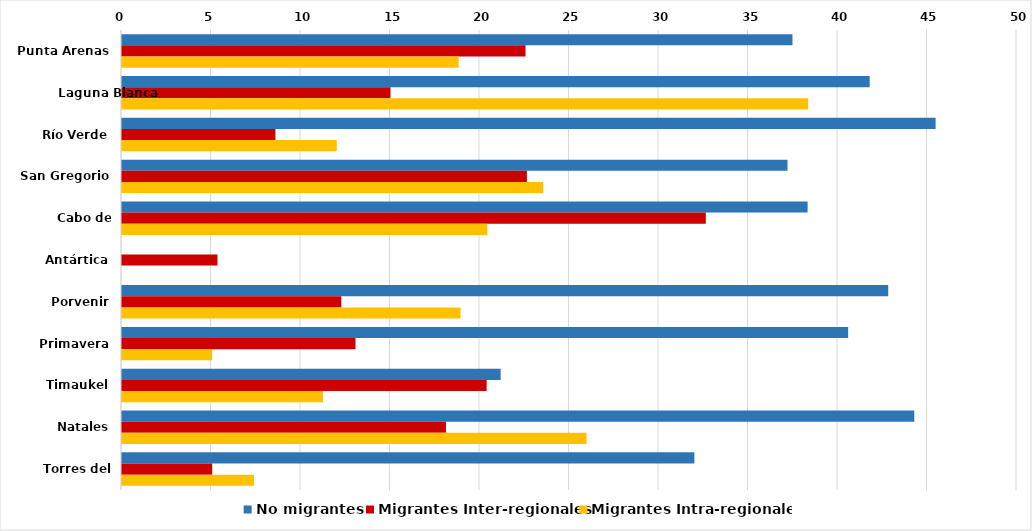
| Category | No migrantes | Migrantes Inter-regionales | Migrantes Intra-regionales |
|---|---|---|---|
| Punta Arenas | 37.456 | 22.544 | 18.809 |
| Laguna Blanca | 41.772 | 15 | 38.333 |
| Río Verde | 45.455 | 8.571 | 12 |
| San Gregorio | 37.179 | 22.619 | 23.529 |
| Cabo de Hornos | 38.302 | 32.615 | 20.408 |
| Antártica | 0 | 5.333 | 0 |
| Porvenir | 42.806 | 12.255 | 18.913 |
| Primavera | 40.566 | 13.043 | 5.036 |
| Timaukel | 21.154 | 20.37 | 11.224 |
| Natales | 44.262 | 18.098 | 25.953 |
| Torres del Paine | 31.977 | 5.039 | 7.377 |